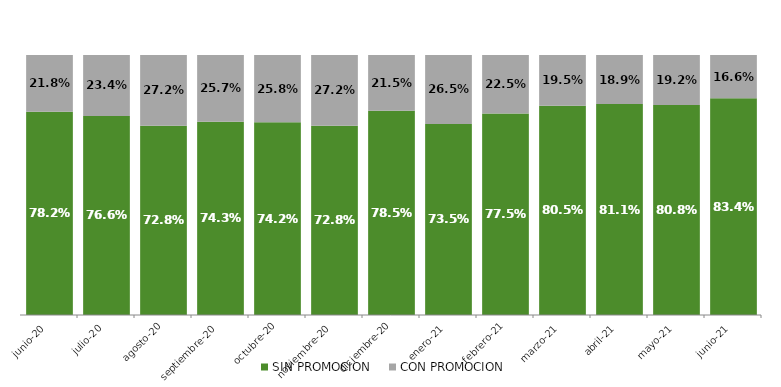
| Category | SIN PROMOCION   | CON PROMOCION   |
|---|---|---|
| 2020-06-01 | 0.782 | 0.218 |
| 2020-07-01 | 0.766 | 0.234 |
| 2020-08-01 | 0.728 | 0.272 |
| 2020-09-01 | 0.743 | 0.257 |
| 2020-10-01 | 0.742 | 0.258 |
| 2020-11-01 | 0.728 | 0.272 |
| 2020-12-01 | 0.785 | 0.215 |
| 2021-01-01 | 0.735 | 0.265 |
| 2021-02-01 | 0.775 | 0.225 |
| 2021-03-01 | 0.805 | 0.195 |
| 2021-04-01 | 0.811 | 0.189 |
| 2021-05-01 | 0.808 | 0.192 |
| 2021-06-01 | 0.834 | 0.166 |